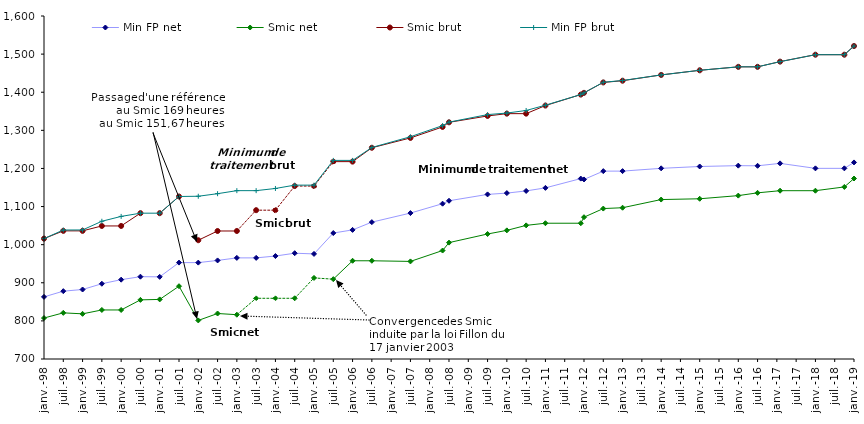
| Category | Min FP net | Smic net  | Smic brut  | Min FP brut |
|---|---|---|---|---|
| 1998-01-01 | 862.99 | 807.51 | 1015.87 | 1015.87 |
| 1998-07-01 | 878.01 | 821.103 | 1036.22 | 1038.46 |
| 1999-01-01 | 882.34 | 818.513 | 1036.22 | 1038.58 |
| 1999-07-01 | 897.46 | 828.688 | 1049.11 | 1061.44 |
| 2000-01-01 | 908.18 | 828.688 | 1049.11 | 1074.13 |
| 2000-07-01 | 916 | 855.144 | 1082.6 | 1082.6 |
| 2001-01-01 | 915.58 | 856.335 | 1082.6 | 1082.6 |
| 2001-07-01 | 952.93 | 890.98 | 1126.4 | 1126.4 |
| 2002-01-01 | 952.9 | 801.218 | 1011.64 | 1127.03 |
| 2002-07-01 | 958.62 | 819.38 | 1035.88 | 1133.79 |
| 2003-01-01 | 965.32 | 816.27 | 1035.88 | 1141.73 |
| 2003-07-01 | 965.32 | 859.32 | 1090.51 | 1141.73 |
| 2004-01-01 | 970.15 | 859.32 | 1090.51 | 1147.43 |
| 2004-07-01 | 977.6 | 859.32 | 1153.76 | 1156.23 |
| 2005-01-01 | 975.74 | 912.73 | 1153.76 | 1156.23 |
| 2005-07-01 | 1030.493 | 909.496 | 1217.88 | 1221.11 |
| 2006-01-01 | 1038.75 | 957.74 | 1217.88 | 1221.11 |
| 2006-07-01 | 1059.1 | 957.74 | 1254.28 | 1255.02 |
| 2007-07-01 | 1082.892 | 956.04 | 1280.07 | 1283.2 |
| 2008-05-01 | 1107.534 | 984.61 | 1308.88 | 1312.4 |
| 2008-07-01 | 1115.222 | 1005.36 | 1321.02 | 1321.52 |
| 2009-07-01 | 1131.915 | 1028 | 1337.7 | 1341.29 |
| 2010-01-01 | 1135.316 | 1037.53 | 1343.77 | 1345.32 |
| 2010-07-01 | 1140.995 | 1050.63 | 1343.77 | 1352.05 |
| 2011-01-01 | 1149.029 | 1056.24 | 1365 | 1365.94 |
| 2011-12-01 | 1173.351 | 1056.24 | 1393.82 | 1393.82 |
| 2012-01-01 | 1171.136 | 1072.07 | 1398.37 | 1398.37 |
| 2012-07-01 | 1192.958 | 1094.71 | 1425.67 | 1426.13 |
| 2013-01-01 | 1192.968 | 1096.94 | 1430.22 | 1430.76 |
| 2014-01-01 | 1200.271 | 1118.36 | 1445.38 | 1445.38 |
| 2015-01-01 | 1205.126 | 1120.43 | 1457.52 | 1457.52 |
| 2016-01-01 | 1207.333 | 1128.7 | 1466.62 | 1466.62 |
| 2016-07-01 | 1206.909 | 1135.99 | 1466.62 | 1466.62 |
| 2017-02-01 | 1213.309 | 1141.61 | 1480.27 | 1480.27 |
| 2018-01-01 | 1200.231 | 1141.61 | 1498.47 | 1498.47 |
| 2018-10-01 | 1200.231 | 1151.5 | 1498.47 | 1498.47 |
| 2019-01-01 | 1215.766 | 1173.6 | 1521.22 | 1521.22 |